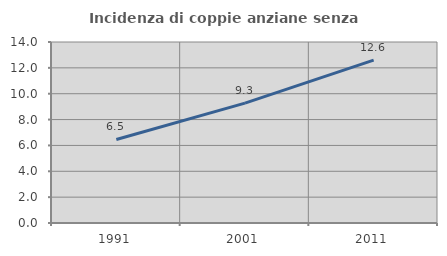
| Category | Incidenza di coppie anziane senza figli  |
|---|---|
| 1991.0 | 6.463 |
| 2001.0 | 9.271 |
| 2011.0 | 12.596 |